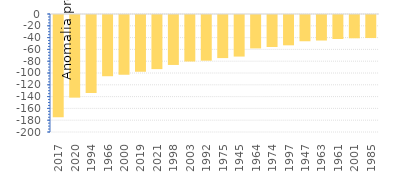
| Category | ANUAL |
|---|---|
| 2017.0 | -173.45 |
| 2020.0 | -140.07 |
| 1994.0 | -132.24 |
| 1966.0 | -103.77 |
| 2000.0 | -101.27 |
| 2019.0 | -96.18 |
| 2021.0 | -91.71 |
| 1998.0 | -84.67 |
| 2003.0 | -78.83 |
| 1992.0 | -77.41 |
| 1975.0 | -73.04 |
| 1945.0 | -70.46 |
| 1964.0 | -56.64 |
| 1974.0 | -54.29 |
| 1997.0 | -51.36 |
| 1947.0 | -44.48 |
| 1963.0 | -43.27 |
| 1961.0 | -40.69 |
| 2001.0 | -39.46 |
| 1985.0 | -39.05 |